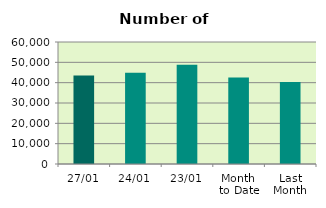
| Category | Series 0 |
|---|---|
| 27/01 | 43510 |
| 24/01 | 44914 |
| 23/01 | 48856 |
| Month 
to Date | 42492.111 |
| Last
Month | 40313.8 |